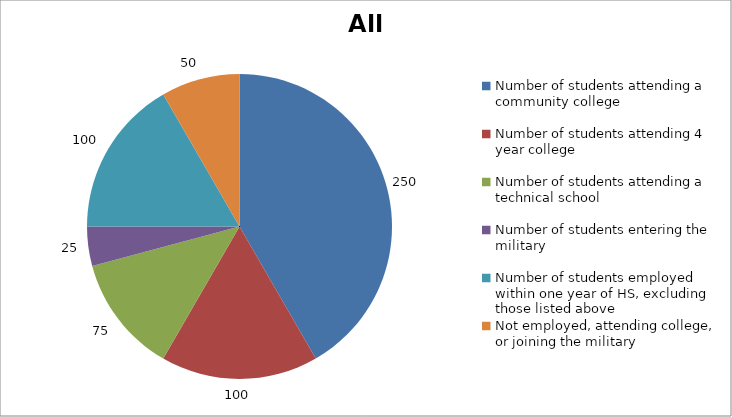
| Category | All Students |
|---|---|
| Number of students attending a community college | 250 |
| Number of students attending 4 year college | 100 |
| Number of students attending a technical school | 75 |
| Number of students entering the military | 25 |
| Number of students employed within one year of HS, excluding those listed above | 100 |
| Not employed, attending college, or joining the military | 50 |